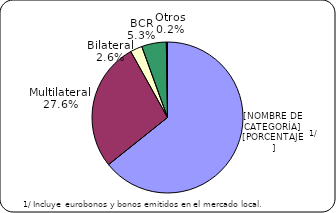
| Category | Series 0 |
|---|---|
| Inversionistas | 8568.5 |
| Multilateral | 3686.1 |
| Bilateral | 340.5 |
| BCR | 704.3 |
| Otros | 33.3 |